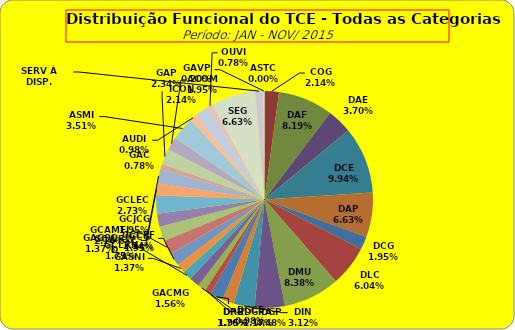
| Category | ASTC COG DAF DAE DCE DAP DCG DLC DMU DGP DIN DPE DRR DGCE DGPA GACMG GAGSC GASNI GCG GCAMFJ GCCFF GCJCG GCLEC GCLRH GCWRWD GAC GAP ACOM ASMI AUDI ICON OUVI SEG SERV À DISP. GAVP |
|---|---|
| ASTC | 0 |
| COG | 11 |
| DAF | 42 |
| DAE | 19 |
| DCE | 51 |
| DAP | 34 |
| DCG | 10 |
| DLC | 31 |
| DMU | 43 |
| DGP | 23 |
| DIN | 16 |
| DPE | 9 |
| DRR | 10 |
| DGCE | 5 |
| DGPA | 6 |
| GACMG | 8 |
| GAGSC | 7 |
| GASNI | 7 |
| GCG | 10 |
| GCAMFJ | 11 |
| GCCFF | 11 |
| GCJCG | 10 |
| GCLEC | 14 |
| GCLRH | 9 |
| GCWRWD | 11 |
| GAC | 4 |
| GAP | 12 |
| ACOM | 10 |
| ASMI | 18 |
| AUDI | 5 |
| ICON | 11 |
| OUVI | 4 |
| SEG | 34 |
| SERV À DISP. | 6 |
| GAVP | 1 |